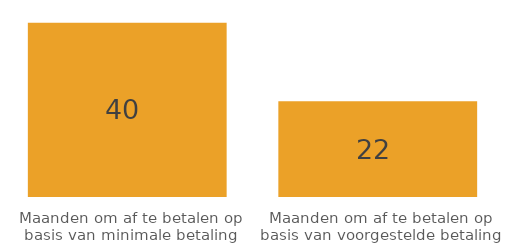
| Category | Series 0 |
|---|---|
| Maanden om af te betalen op basis van minimale betaling | 40 |
| Maanden om af te betalen op basis van voorgestelde betaling | 22 |